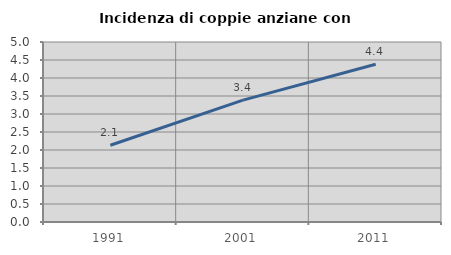
| Category | Incidenza di coppie anziane con figli |
|---|---|
| 1991.0 | 2.132 |
| 2001.0 | 3.386 |
| 2011.0 | 4.382 |